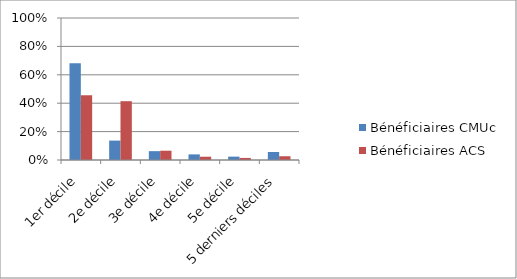
| Category | Bénéficiaires CMUc | Bénéficiaires ACS |
|---|---|---|
| 1er décile | 0.682 | 0.456 |
| 2e décile | 0.137 | 0.414 |
| 3e décile | 0.062 | 0.065 |
| 4e décile | 0.039 | 0.023 |
| 5e décile | 0.024 | 0.014 |
| 5 derniers déciles | 0.056 | 0.026 |